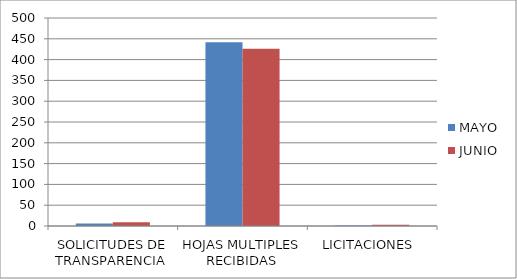
| Category | MAYO | JUNIO |
|---|---|---|
| SOLICITUDES DE TRANSPARENCIA  | 6 | 9 |
| HOJAS MULTIPLES RECIBIDAS | 442 | 426 |
| LICITACIONES  | 1 | 3 |